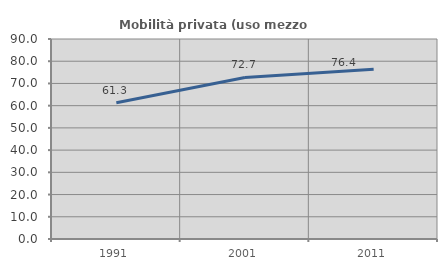
| Category | Mobilità privata (uso mezzo privato) |
|---|---|
| 1991.0 | 61.302 |
| 2001.0 | 72.708 |
| 2011.0 | 76.416 |